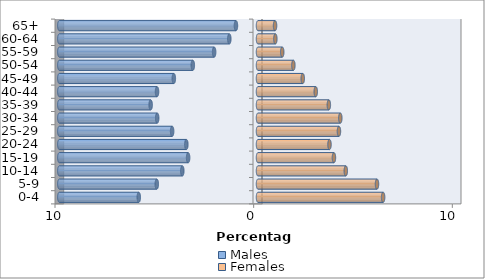
| Category | Males | Females |
|---|---|---|
| 0-4 | -6.002 | 6.299 |
| 5-9 | -5.095 | 5.99 |
| 10-14 | -3.81 | 4.42 |
| 15-19 | -3.517 | 3.822 |
| 20-24 | -3.607 | 3.599 |
| 25-29 | -4.322 | 4.074 |
| 30-34 | -5.075 | 4.143 |
| 35-39 | -5.404 | 3.566 |
| 40-44 | -5.083 | 2.907 |
| 45-49 | -4.237 | 2.253 |
| 50-54 | -3.281 | 1.781 |
| 55-59 | -2.208 | 1.22 |
| 60-64 | -1.444 | 0.874 |
| 65+ | -1.11 | 0.858 |